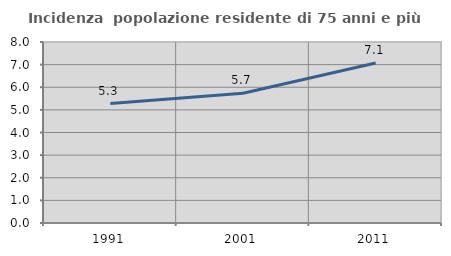
| Category | Incidenza  popolazione residente di 75 anni e più |
|---|---|
| 1991.0 | 5.277 |
| 2001.0 | 5.731 |
| 2011.0 | 7.073 |